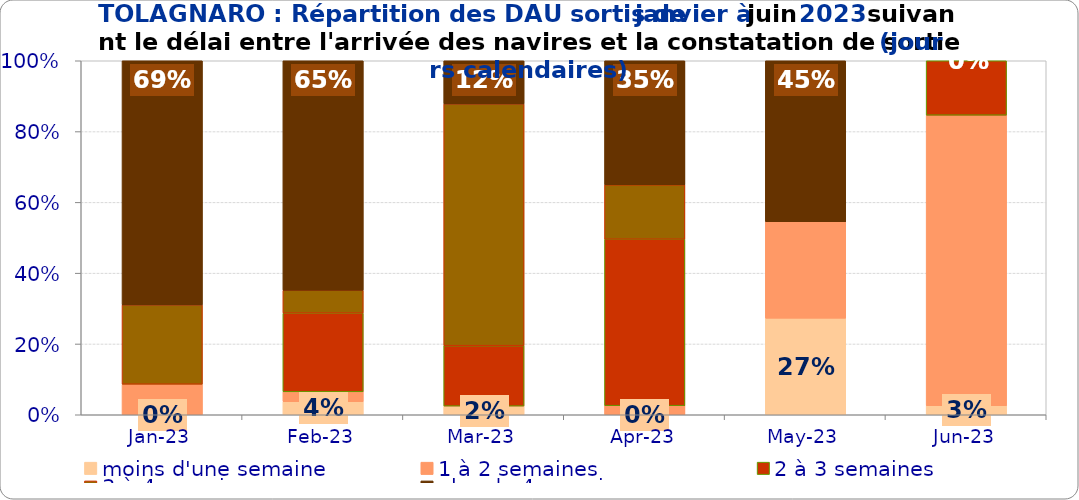
| Category | moins d'une semaine | 1 à 2 semaines | 2 à 3 semaines | 3 à 4 semaines | plus de 4 semaines |
|---|---|---|---|---|---|
| 2023-01-01 | 0 | 0.086 | 0 | 0.224 | 0.69 |
| 2023-02-01 | 0.037 | 0.028 | 0.222 | 0.065 | 0.648 |
| 2023-03-01 | 0.024 | 0 | 0.171 | 0.683 | 0.122 |
| 2023-04-01 | 0 | 0.026 | 0.47 | 0.154 | 0.35 |
| 2023-05-01 | 0.273 | 0.273 | 0 | 0 | 0.455 |
| 2023-06-01 | 0.026 | 0.821 | 0.154 | 0 | 0 |